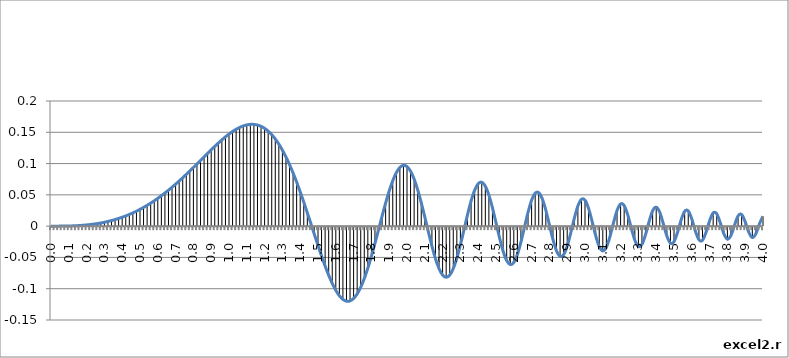
| Category | Series 0 |
|---|---|
| 0.0 | 0 |
| 0.02 | 0 |
| 0.04 | 0 |
| 0.06 | 0 |
| 0.08 | 0 |
| 0.1 | 0 |
| 0.12 | 0 |
| 0.14 | 0.001 |
| 0.16 | 0.001 |
| 0.18 | 0.001 |
| 0.2 | 0.002 |
| 0.22 | 0.003 |
| 0.24 | 0.003 |
| 0.26 | 0.004 |
| 0.28 | 0.005 |
| 0.3 | 0.006 |
| 0.32 | 0.007 |
| 0.34 | 0.009 |
| 0.36 | 0.011 |
| 0.38 | 0.012 |
| 0.4 | 0.014 |
| 0.42 | 0.016 |
| 0.44 | 0.019 |
| 0.46 | 0.021 |
| 0.48 | 0.024 |
| 0.5 | 0.027 |
| 0.52 | 0.03 |
| 0.54 | 0.033 |
| 0.56 | 0.037 |
| 0.58 | 0.041 |
| 0.6 | 0.044 |
| 0.62 | 0.049 |
| 0.64 | 0.053 |
| 0.66 | 0.057 |
| 0.68 | 0.062 |
| 0.7000000000000001 | 0.067 |
| 0.72 | 0.072 |
| 0.74 | 0.077 |
| 0.76 | 0.083 |
| 0.78 | 0.088 |
| 0.8 | 0.094 |
| 0.8200000000000001 | 0.099 |
| 0.84 | 0.105 |
| 0.86 | 0.111 |
| 0.88 | 0.116 |
| 0.9 | 0.122 |
| 0.92 | 0.127 |
| 0.9400000000000001 | 0.133 |
| 0.96 | 0.138 |
| 0.98 | 0.143 |
| 1.0 | 0.147 |
| 1.02 | 0.151 |
| 1.04 | 0.155 |
| 1.06 | 0.158 |
| 1.08 | 0.16 |
| 1.1 | 0.162 |
| 1.12 | 0.163 |
| 1.1400000000000001 | 0.163 |
| 1.16 | 0.162 |
| 1.18 | 0.159 |
| 1.2 | 0.156 |
| 1.22 | 0.152 |
| 1.24 | 0.146 |
| 1.26 | 0.139 |
| 1.28 | 0.131 |
| 1.3 | 0.121 |
| 1.32 | 0.111 |
| 1.34 | 0.098 |
| 1.36 | 0.085 |
| 1.3800000000000001 | 0.07 |
| 1.4000000000000001 | 0.055 |
| 1.42 | 0.038 |
| 1.44 | 0.021 |
| 1.46 | 0.004 |
| 1.48 | -0.014 |
| 1.5 | -0.031 |
| 1.52 | -0.048 |
| 1.54 | -0.064 |
| 1.56 | -0.078 |
| 1.58 | -0.092 |
| 1.6 | -0.103 |
| 1.62 | -0.111 |
| 1.6400000000000001 | -0.117 |
| 1.6600000000000001 | -0.12 |
| 1.68 | -0.119 |
| 1.7 | -0.116 |
| 1.72 | -0.108 |
| 1.74 | -0.098 |
| 1.76 | -0.084 |
| 1.78 | -0.067 |
| 1.8 | -0.048 |
| 1.82 | -0.027 |
| 1.84 | -0.006 |
| 1.86 | 0.016 |
| 1.8800000000000001 | 0.037 |
| 1.9000000000000001 | 0.056 |
| 1.92 | 0.073 |
| 1.94 | 0.085 |
| 1.96 | 0.094 |
| 1.98 | 0.097 |
| 2.0 | 0.095 |
| 2.02 | 0.088 |
| 2.04 | 0.075 |
| 2.06 | 0.058 |
| 2.08 | 0.038 |
| 2.1 | 0.015 |
| 2.12 | -0.009 |
| 2.14 | -0.032 |
| 2.16 | -0.052 |
| 2.18 | -0.068 |
| 2.2 | -0.078 |
| 2.22 | -0.082 |
| 2.24 | -0.078 |
| 2.2600000000000002 | -0.068 |
| 2.2800000000000002 | -0.051 |
| 2.3000000000000003 | -0.03 |
| 2.32 | -0.006 |
| 2.34 | 0.018 |
| 2.36 | 0.04 |
| 2.38 | 0.057 |
| 2.4 | 0.068 |
| 2.42 | 0.07 |
| 2.44 | 0.064 |
| 2.46 | 0.05 |
| 2.48 | 0.029 |
| 2.5 | 0.005 |
| 2.52 | -0.019 |
| 2.54 | -0.04 |
| 2.56 | -0.055 |
| 2.58 | -0.061 |
| 2.6 | -0.058 |
| 2.62 | -0.045 |
| 2.64 | -0.026 |
| 2.66 | -0.002 |
| 2.68 | 0.022 |
| 2.7 | 0.041 |
| 2.72 | 0.053 |
| 2.74 | 0.053 |
| 2.7600000000000002 | 0.044 |
| 2.7800000000000002 | 0.025 |
| 2.8000000000000003 | 0.002 |
| 2.82 | -0.021 |
| 2.84 | -0.039 |
| 2.86 | -0.048 |
| 2.88 | -0.046 |
| 2.9 | -0.032 |
| 2.92 | -0.011 |
| 2.94 | 0.013 |
| 2.96 | 0.032 |
| 2.98 | 0.043 |
| 3.0 | 0.041 |
| 3.02 | 0.028 |
| 3.04 | 0.007 |
| 3.06 | -0.015 |
| 3.08 | -0.033 |
| 3.1 | -0.04 |
| 3.12 | -0.034 |
| 3.14 | -0.017 |
| 3.16 | 0.005 |
| 3.18 | 0.025 |
| 3.2 | 0.035 |
| 3.22 | 0.033 |
| 3.24 | 0.018 |
| 3.2600000000000002 | -0.003 |
| 3.2800000000000002 | -0.023 |
| 3.3000000000000003 | -0.033 |
| 3.3200000000000003 | -0.029 |
| 3.34 | -0.014 |
| 3.36 | 0.007 |
| 3.38 | 0.024 |
| 3.4 | 0.03 |
| 3.42 | 0.022 |
| 3.44 | 0.004 |
| 3.46 | -0.016 |
| 3.48 | -0.027 |
| 3.5 | -0.025 |
| 3.52 | -0.01 |
| 3.54 | 0.01 |
| 3.56 | 0.024 |
| 3.58 | 0.024 |
| 3.6 | 0.011 |
| 3.62 | -0.008 |
| 3.64 | -0.022 |
| 3.66 | -0.023 |
| 3.68 | -0.01 |
| 3.7 | 0.009 |
| 3.72 | 0.021 |
| 3.74 | 0.02 |
| 3.7600000000000002 | 0.005 |
| 3.7800000000000002 | -0.012 |
| 3.8000000000000003 | -0.021 |
| 3.8200000000000003 | -0.015 |
| 3.84 | 0.002 |
| 3.86 | 0.016 |
| 3.88 | 0.019 |
| 3.9 | 0.007 |
| 3.92 | -0.01 |
| 3.94 | -0.018 |
| 3.96 | -0.012 |
| 3.98 | 0.004 |
| 4.0 | 0.016 |